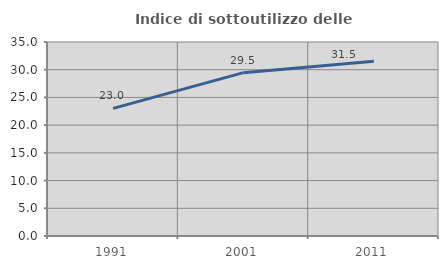
| Category | Indice di sottoutilizzo delle abitazioni  |
|---|---|
| 1991.0 | 23.034 |
| 2001.0 | 29.467 |
| 2011.0 | 31.523 |